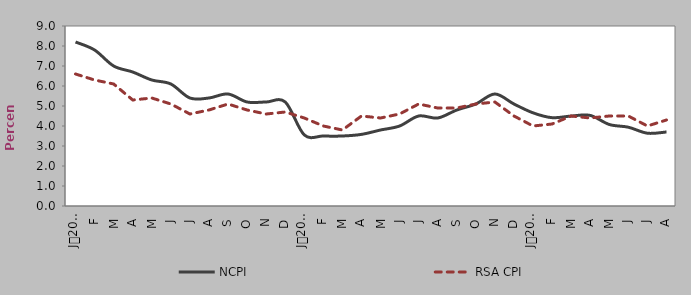
| Category | NCPI | RSA CPI |
|---|---|---|
| 0 | 8.2 | 6.6 |
| 1900-01-01 | 7.8 | 6.3 |
| 1900-01-02 | 7 | 6.1 |
| 1900-01-03 | 6.7 | 5.3 |
| 1900-01-04 | 6.3 | 5.4 |
| 1900-01-05 | 6.1 | 5.1 |
| 1900-01-06 | 5.4 | 4.6 |
| 1900-01-07 | 5.4 | 4.8 |
| 1900-01-08 | 5.6 | 5.1 |
| 1900-01-09 | 5.2 | 4.8 |
| 1900-01-10 | 5.2 | 4.6 |
| 1900-01-11 | 5.2 | 4.7 |
| 1900-01-12 | 3.555 | 4.4 |
| 1900-01-13 | 3.5 | 4 |
| 1900-01-14 | 3.5 | 3.8 |
| 1900-01-15 | 3.581 | 4.5 |
| 1900-01-16 | 3.8 | 4.4 |
| 1900-01-17 | 4 | 4.6 |
| 1900-01-18 | 4.5 | 5.1 |
| 1900-01-19 | 4.4 | 4.9 |
| 1900-01-20 | 4.8 | 4.9 |
| 1900-01-21 | 5.1 | 5.1 |
| 1900-01-22 | 5.6 | 5.2 |
| 1900-01-23 | 5.1 | 4.5 |
| 1900-01-24 | 4.658 | 4 |
| 1900-01-25 | 4.416 | 4.1 |
| 1900-01-26 | 4.498 | 4.5 |
| 1900-01-27 | 4.529 | 4.4 |
| 1900-01-28 | 4.076 | 4.5 |
| 1900-01-29 | 3.939 | 4.5 |
| 1900-01-30 | 3.639 | 4 |
| 1900-01-31 | 3.7 | 4.3 |